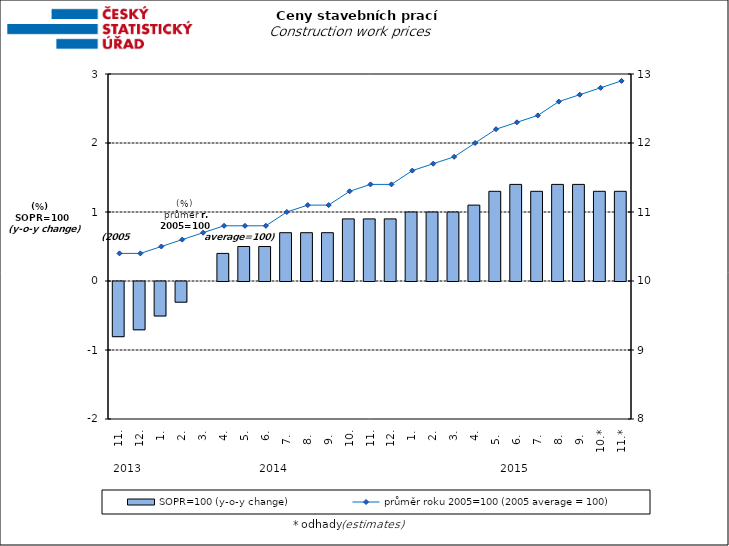
| Category | SOPR=100 (y-o-y change)   |
|---|---|
| 0 | -0.8 |
| 1 | -0.7 |
| 2 | -0.5 |
| 3 | -0.3 |
| 4 | 0 |
| 5 | 0.4 |
| 6 | 0.5 |
| 7 | 0.5 |
| 8 | 0.7 |
| 9 | 0.7 |
| 10 | 0.7 |
| 11 | 0.9 |
| 12 | 0.9 |
| 13 | 0.9 |
| 14 | 1 |
| 15 | 1 |
| 16 | 1 |
| 17 | 1.1 |
| 18 | 1.3 |
| 19 | 1.4 |
| 20 | 1.3 |
| 21 | 1.4 |
| 22 | 1.4 |
| 23 | 1.3 |
| 24 | 1.3 |